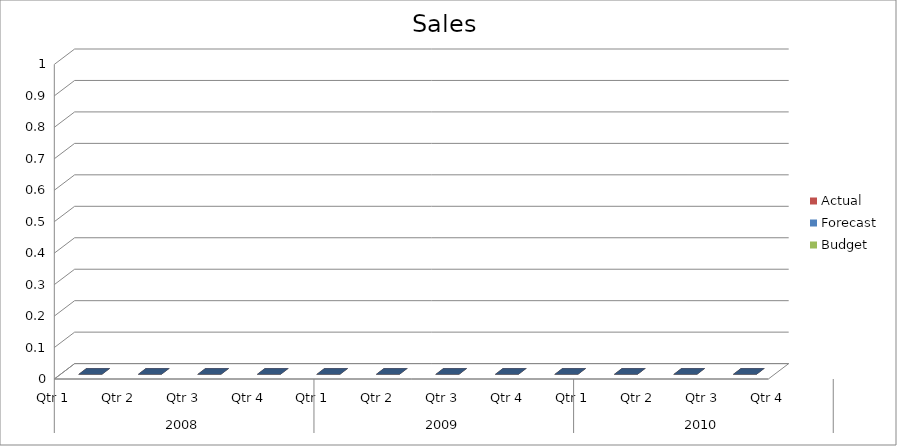
| Category | Budget | Forecast | Actual |
|---|---|---|---|
| 0 | 840 | 720 | 2100 |
| 1 | 600 | 570 | 2600 |
| 2 | 2450 | 1590 | 2630 |
| 3 | 1190 | 970 | 2590 |
| 4 | 2270 | 2660 | 1380 |
| 5 | 3470 | 1940 | 1730 |
| 6 | 2480 | 2070 | 2590 |
| 7 | 1800 | 690 | 1150 |
| 8 | 2670 | 1230 | 2850 |
| 9 | 580 | 2660 | 540 |
| 10 | 1650 | 2930 | 2280 |
| 11 | 2910 | 1560 | 510 |